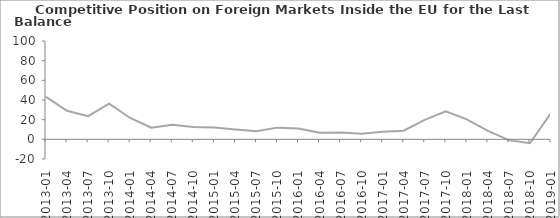
| Category | Balance |
|---|---|
| 2013-01 | 43.2 |
| 2013-04 | 29.1 |
| 2013-07 | 23.6 |
| 2013-10 | 36.3 |
| 2014-01 | 21.7 |
| 2014-04 | 11.8 |
| 2014-07 | 14.7 |
| 2014-10 | 12.6 |
| 2015-01 | 12.1 |
| 2015-04 | 10.1 |
| 2015-07 | 8.3 |
| 2015-10 | 11.9 |
| 2016-01 | 10.9 |
| 2016-04 | 6.8 |
| 2016-07 | 7 |
| 2016-10 | 5.8 |
| 2017-01 | 7.8 |
| 2017-04 | 8.8 |
| 2017-07 | 19.8 |
| 2017-10 | 28.4 |
| 2018-01 | 20.3 |
| 2018-04 | 8.5 |
| 2018-07 | -0.8 |
| 2018-10 | -4 |
| 2019-01 | 26.7 |